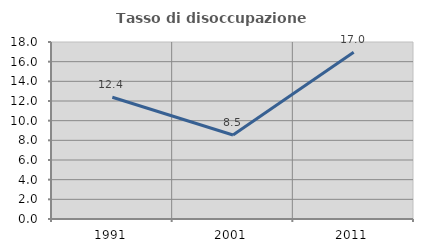
| Category | Tasso di disoccupazione giovanile  |
|---|---|
| 1991.0 | 12.381 |
| 2001.0 | 8.547 |
| 2011.0 | 16.964 |